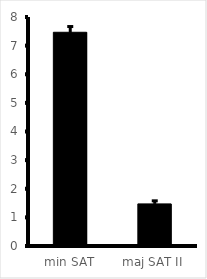
| Category | Series 0 |
|---|---|
| min SAT | 7.467 |
| maj SAT II | 1.471 |